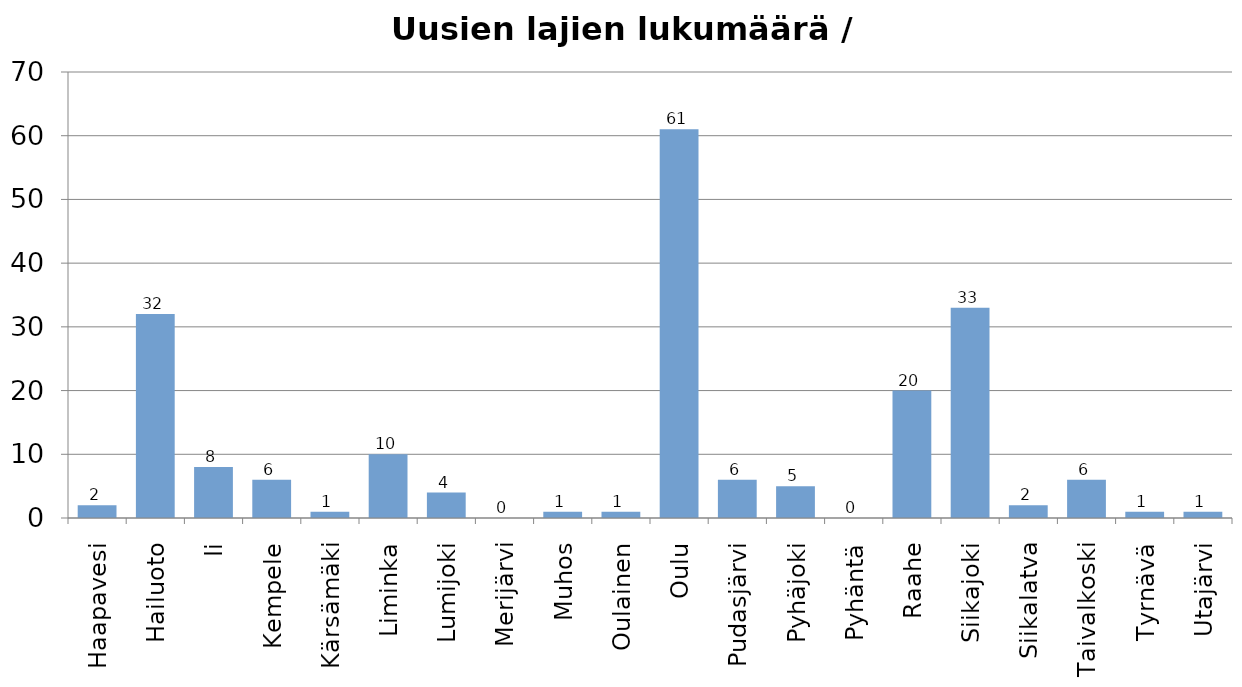
| Category | Yhteensä |
|---|---|
| Haapavesi | 2 |
| Hailuoto | 32 |
| Ii | 8 |
| Kempele | 6 |
| Kärsämäki | 1 |
| Liminka | 10 |
| Lumijoki | 4 |
| Merijärvi | 0 |
| Muhos | 1 |
| Oulainen | 1 |
| Oulu | 61 |
| Pudasjärvi | 6 |
| Pyhäjoki | 5 |
| Pyhäntä | 0 |
| Raahe | 20 |
| Siikajoki | 33 |
| Siikalatva | 2 |
| Taivalkoski | 6 |
| Tyrnävä | 1 |
| Utajärvi | 1 |